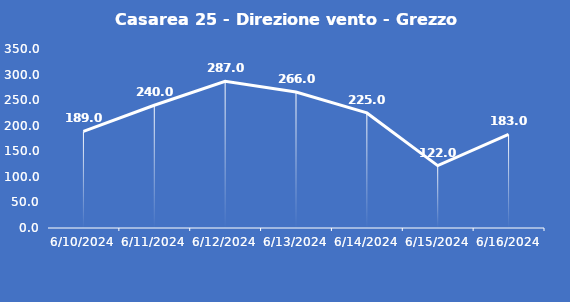
| Category | Casarea 25 - Direzione vento - Grezzo (°N) |
|---|---|
| 6/10/24 | 189 |
| 6/11/24 | 240 |
| 6/12/24 | 287 |
| 6/13/24 | 266 |
| 6/14/24 | 225 |
| 6/15/24 | 122 |
| 6/16/24 | 183 |